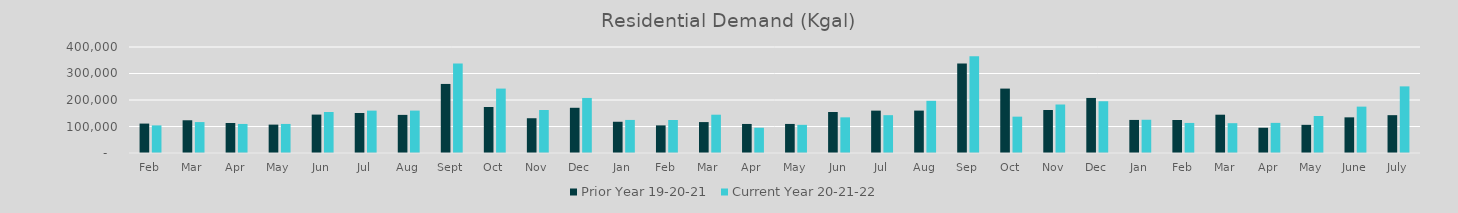
| Category | Prior Year 19-20-21 | Current Year 20-21-22 |
|---|---|---|
| Feb | 111009.962 | 104204.224 |
| Mar | 123525.131 | 116687.491 |
| Apr | 113258.787 | 109598.965 |
| May | 107128.051 | 109656.015 |
| Jun | 144930.453 | 154696.236 |
| Jul | 151028.014 | 159889.353 |
| Aug | 143816.337 | 160013.985 |
| Sep | 260607.456 | 337995.641 |
| Oct | 173601.368 | 243049.084 |
| Nov | 131198.833 | 162175.563 |
| Dec | 170629.384 | 207737.904 |
| Jan | 117899.625 | 124779.797 |
| Feb | 104204.224 | 124538.238 |
| Mar | 116687.491 | 144510.137 |
| Apr | 109598.965 | 95313.825 |
| May | 109656.015 | 106271.913 |
| Jun | 154696.236 | 134556.172 |
| Jul | 159889.353 | 142779.003 |
| Aug | 160013.985 | 196888.231 |
| Sep | 337995.641 | 364911.478 |
| Oct | 243049.084 | 137121.969 |
| Nov | 162175.563 | 182996.966 |
| Dec | 207737.904 | 195285.925 |
| Jan | 124779.797 | 125449.092 |
| Feb | 124538.238 | 113415.44 |
| Mar | 144510.137 | 112550.393 |
| Apr | 95313.825 | 113675.535 |
| May | 106271.913 | 139571.108 |
| June | 134556.172 | 175001.205 |
| July | 142779.003 | 251418.545 |